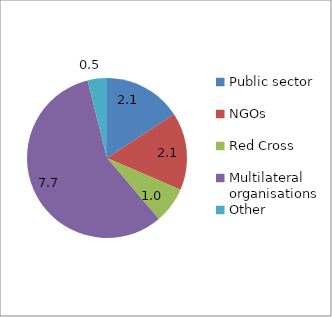
| Category | 2008 |
|---|---|
| Public sector | 2.115 |
| NGOs  | 2.104 |
| Red Cross | 0.974 |
| Multilateral organisations | 7.675 |
| Other | 0.524 |